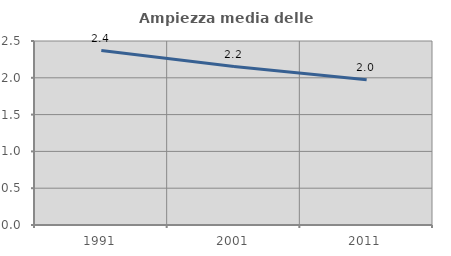
| Category | Ampiezza media delle famiglie |
|---|---|
| 1991.0 | 2.37 |
| 2001.0 | 2.153 |
| 2011.0 | 1.972 |